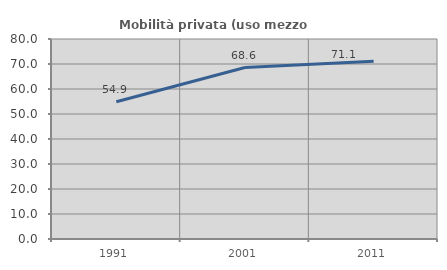
| Category | Mobilità privata (uso mezzo privato) |
|---|---|
| 1991.0 | 54.922 |
| 2001.0 | 68.578 |
| 2011.0 | 71.085 |